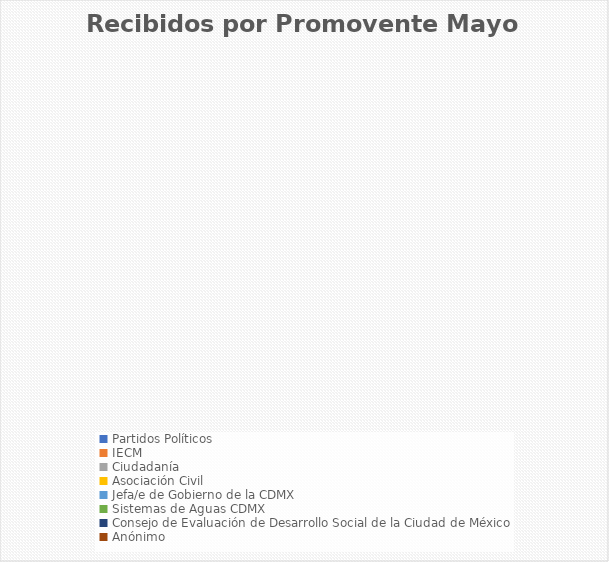
| Category | Recibidos por Promovente Mayo |
|---|---|
| Partidos Políticos | 0 |
| IECM | 0 |
| Ciudadanía  | 0 |
| Asociación Civil | 0 |
| Jefa/e de Gobierno de la CDMX | 0 |
| Sistemas de Aguas CDMX | 0 |
| Consejo de Evaluación de Desarrollo Social de la Ciudad de México | 0 |
| Anónimo | 0 |